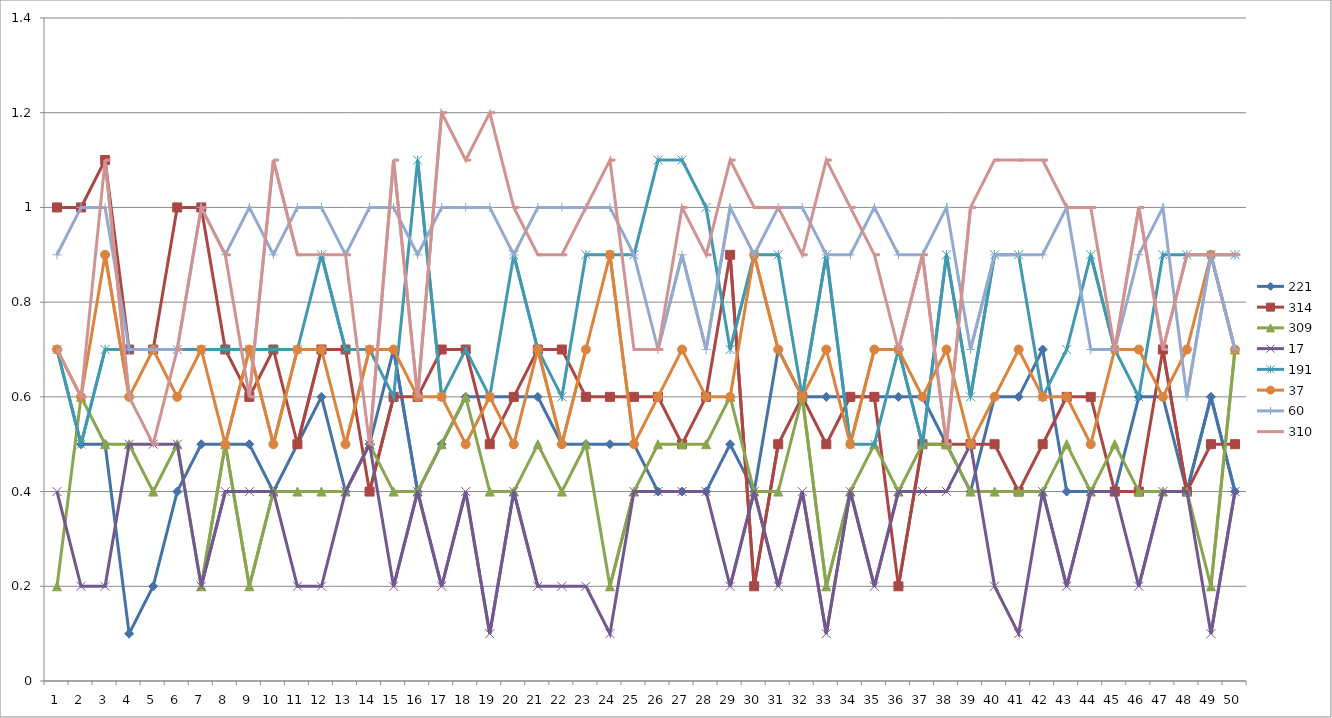
| Category | 221 | 314 | 309 | 17 | 191 | 37 | 60 | 310 |
|---|---|---|---|---|---|---|---|---|
| 0 | 0.7 | 1 | 0.2 | 0.4 | 0.7 | 0.7 | 0.9 | 0.7 |
| 1 | 0.5 | 1 | 0.6 | 0.2 | 0.5 | 0.6 | 1 | 0.6 |
| 2 | 0.5 | 1.1 | 0.5 | 0.2 | 0.7 | 0.9 | 1 | 1.1 |
| 3 | 0.1 | 0.7 | 0.5 | 0.5 | 0.7 | 0.6 | 0.7 | 0.6 |
| 4 | 0.2 | 0.7 | 0.4 | 0.5 | 0.7 | 0.7 | 0.7 | 0.5 |
| 5 | 0.4 | 1 | 0.5 | 0.5 | 0.7 | 0.6 | 0.7 | 0.7 |
| 6 | 0.5 | 1 | 0.2 | 0.2 | 0.7 | 0.7 | 1 | 1 |
| 7 | 0.5 | 0.7 | 0.5 | 0.4 | 0.7 | 0.5 | 0.9 | 0.9 |
| 8 | 0.5 | 0.6 | 0.2 | 0.4 | 0.7 | 0.7 | 1 | 0.6 |
| 9 | 0.4 | 0.7 | 0.4 | 0.4 | 0.7 | 0.5 | 0.9 | 1.1 |
| 10 | 0.5 | 0.5 | 0.4 | 0.2 | 0.7 | 0.7 | 1 | 0.9 |
| 11 | 0.6 | 0.7 | 0.4 | 0.2 | 0.9 | 0.7 | 1 | 0.9 |
| 12 | 0.4 | 0.7 | 0.4 | 0.4 | 0.7 | 0.5 | 0.9 | 0.9 |
| 13 | 0.5 | 0.4 | 0.5 | 0.5 | 0.7 | 0.7 | 1 | 0.5 |
| 14 | 0.7 | 0.6 | 0.4 | 0.2 | 0.6 | 0.7 | 1 | 1.1 |
| 15 | 0.4 | 0.6 | 0.4 | 0.4 | 1.1 | 0.6 | 0.9 | 0.6 |
| 16 | 0.5 | 0.7 | 0.5 | 0.2 | 0.6 | 0.6 | 1 | 1.2 |
| 17 | 0.6 | 0.7 | 0.6 | 0.4 | 0.7 | 0.5 | 1 | 1.1 |
| 18 | 0.6 | 0.5 | 0.4 | 0.1 | 0.6 | 0.6 | 1 | 1.2 |
| 19 | 0.6 | 0.6 | 0.4 | 0.4 | 0.9 | 0.5 | 0.9 | 1 |
| 20 | 0.6 | 0.7 | 0.5 | 0.2 | 0.7 | 0.7 | 1 | 0.9 |
| 21 | 0.5 | 0.7 | 0.4 | 0.2 | 0.6 | 0.5 | 1 | 0.9 |
| 22 | 0.5 | 0.6 | 0.5 | 0.2 | 0.9 | 0.7 | 1 | 1 |
| 23 | 0.5 | 0.6 | 0.2 | 0.1 | 0.9 | 0.9 | 1 | 1.1 |
| 24 | 0.5 | 0.6 | 0.4 | 0.4 | 0.9 | 0.5 | 0.9 | 0.7 |
| 25 | 0.4 | 0.6 | 0.5 | 0.4 | 1.1 | 0.6 | 0.7 | 0.7 |
| 26 | 0.4 | 0.5 | 0.5 | 0.4 | 1.1 | 0.7 | 0.9 | 1 |
| 27 | 0.4 | 0.6 | 0.5 | 0.4 | 1 | 0.6 | 0.7 | 0.9 |
| 28 | 0.5 | 0.9 | 0.6 | 0.2 | 0.7 | 0.6 | 1 | 1.1 |
| 29 | 0.4 | 0.2 | 0.4 | 0.4 | 0.9 | 0.9 | 0.9 | 1 |
| 30 | 0.7 | 0.5 | 0.4 | 0.2 | 0.9 | 0.7 | 1 | 1 |
| 31 | 0.6 | 0.6 | 0.6 | 0.4 | 0.6 | 0.6 | 1 | 0.9 |
| 32 | 0.6 | 0.5 | 0.2 | 0.1 | 0.9 | 0.7 | 0.9 | 1.1 |
| 33 | 0.6 | 0.6 | 0.4 | 0.4 | 0.5 | 0.5 | 0.9 | 1 |
| 34 | 0.6 | 0.6 | 0.5 | 0.2 | 0.5 | 0.7 | 1 | 0.9 |
| 35 | 0.6 | 0.2 | 0.4 | 0.4 | 0.7 | 0.7 | 0.9 | 0.7 |
| 36 | 0.6 | 0.5 | 0.5 | 0.4 | 0.5 | 0.6 | 0.9 | 0.9 |
| 37 | 0.5 | 0.5 | 0.5 | 0.4 | 0.9 | 0.7 | 1 | 0.5 |
| 38 | 0.4 | 0.5 | 0.4 | 0.5 | 0.6 | 0.5 | 0.7 | 1 |
| 39 | 0.6 | 0.5 | 0.4 | 0.2 | 0.9 | 0.6 | 0.9 | 1.1 |
| 40 | 0.6 | 0.4 | 0.4 | 0.1 | 0.9 | 0.7 | 0.9 | 1.1 |
| 41 | 0.7 | 0.5 | 0.4 | 0.4 | 0.6 | 0.6 | 0.9 | 1.1 |
| 42 | 0.4 | 0.6 | 0.5 | 0.2 | 0.7 | 0.6 | 1 | 1 |
| 43 | 0.4 | 0.6 | 0.4 | 0.4 | 0.9 | 0.5 | 0.7 | 1 |
| 44 | 0.4 | 0.4 | 0.5 | 0.4 | 0.7 | 0.7 | 0.7 | 0.7 |
| 45 | 0.6 | 0.4 | 0.4 | 0.2 | 0.6 | 0.7 | 0.9 | 1 |
| 46 | 0.6 | 0.7 | 0.4 | 0.4 | 0.9 | 0.6 | 1 | 0.7 |
| 47 | 0.4 | 0.4 | 0.4 | 0.4 | 0.9 | 0.7 | 0.6 | 0.9 |
| 48 | 0.6 | 0.5 | 0.2 | 0.1 | 0.9 | 0.9 | 0.9 | 0.9 |
| 49 | 0.4 | 0.5 | 0.7 | 0.4 | 0.9 | 0.7 | 0.7 | 0.9 |